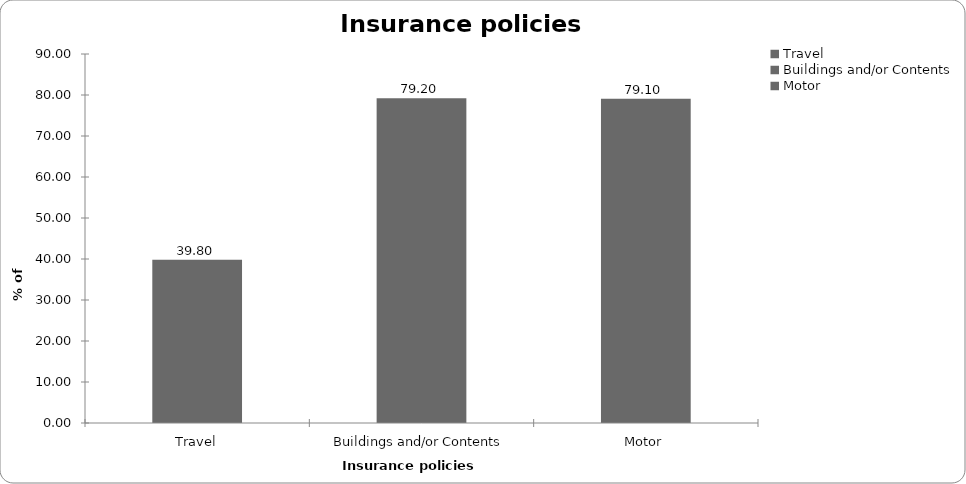
| Category | Insurance policies held |
|---|---|
| Travel | 39.801 |
| Buildings and/or Contents | 79.204 |
| Motor | 79.104 |